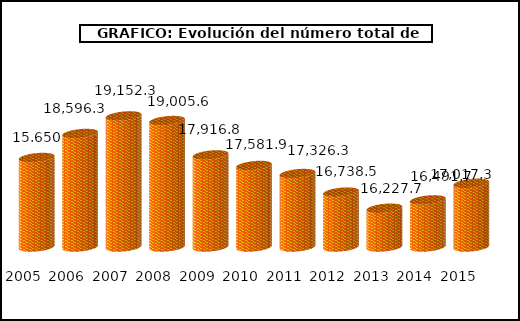
| Category | Series 0 |
|---|---|
| 2005.0 | 17835.4 |
| 2006.0 | 18596.3 |
| 2007.0 | 19152.3 |
| 2008.0 | 19005.6 |
| 2009.0 | 17916.8 |
| 2010.0 | 17581.9 |
| 2011.0 | 17326.3 |
| 2012.0 | 16738.5 |
| 2013.0 | 16227.7 |
| 2014.0 | 16491.7 |
| 2015.0 | 17017.3 |